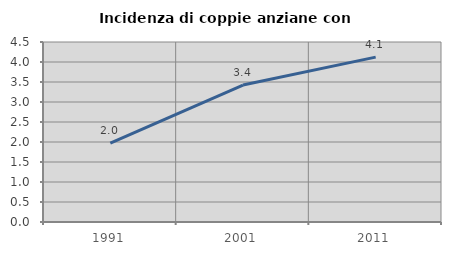
| Category | Incidenza di coppie anziane con figli |
|---|---|
| 1991.0 | 1.97 |
| 2001.0 | 3.423 |
| 2011.0 | 4.121 |